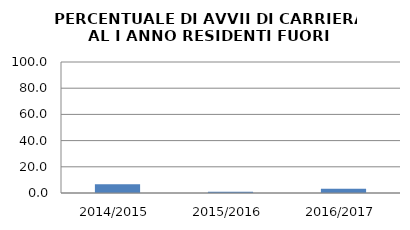
| Category | 2014/2015 2015/2016 2016/2017 |
|---|---|
| 2014/2015 | 6.667 |
| 2015/2016 | 1.02 |
| 2016/2017 | 3.226 |